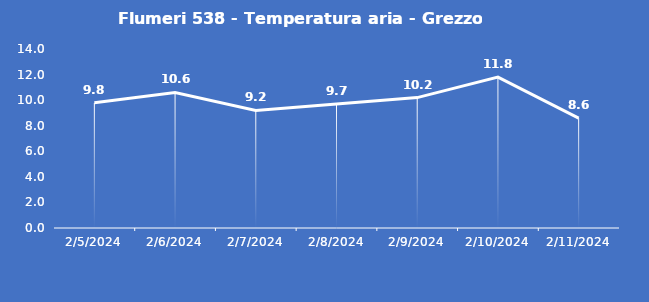
| Category | Flumeri 538 - Temperatura aria - Grezzo (°C) |
|---|---|
| 2/5/24 | 9.8 |
| 2/6/24 | 10.6 |
| 2/7/24 | 9.2 |
| 2/8/24 | 9.7 |
| 2/9/24 | 10.2 |
| 2/10/24 | 11.8 |
| 2/11/24 | 8.6 |